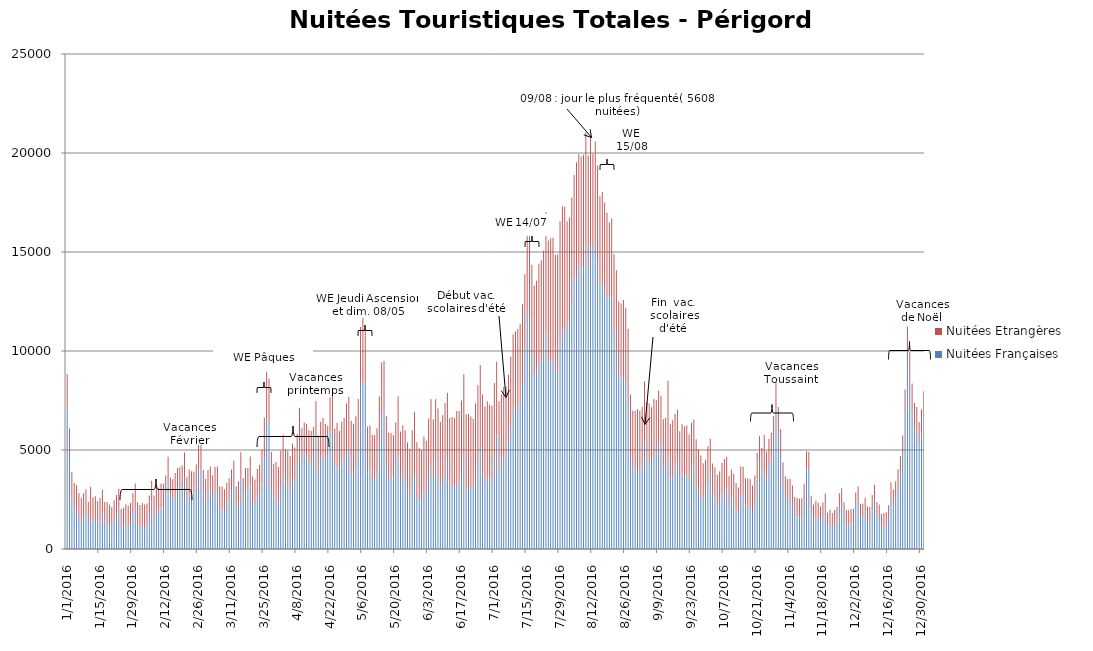
| Category | Nuitées Françaises | Nuitées Etrangères |
|---|---|---|
| 1/1/16 | 7158 | 1670 |
| 1/2/16 | 4649 | 1435 |
| 1/3/16 | 2537 | 1347 |
| 1/4/16 | 2102 | 1237 |
| 1/5/16 | 1889 | 1344 |
| 1/6/16 | 1685 | 1145 |
| 1/7/16 | 1405 | 1171 |
| 1/8/16 | 1640 | 1179 |
| 1/9/16 | 1884 | 1125 |
| 1/10/16 | 1428 | 958 |
| 1/11/16 | 1564 | 1576 |
| 1/12/16 | 1444 | 1171 |
| 1/13/16 | 1313 | 1351 |
| 1/14/16 | 1394 | 1017 |
| 1/15/16 | 1453 | 1117 |
| 1/16/16 | 1887 | 1117 |
| 1/17/16 | 1384 | 992 |
| 1/18/16 | 1260 | 1119 |
| 1/19/16 | 1213 | 1037 |
| 1/20/16 | 1273 | 853 |
| 1/21/16 | 1386 | 1068 |
| 1/22/16 | 1746 | 977 |
| 1/23/16 | 2086 | 959 |
| 1/24/16 | 1160 | 857 |
| 1/25/16 | 1126 | 959 |
| 1/26/16 | 1232 | 1026 |
| 1/27/16 | 1211 | 982 |
| 1/28/16 | 1275 | 1047 |
| 1/29/16 | 1751 | 1070 |
| 1/30/16 | 2103 | 1210 |
| 1/31/16 | 1197 | 1167 |
| 2/1/16 | 1167 | 1056 |
| 2/2/16 | 1160 | 1152 |
| 2/3/16 | 1019 | 1226 |
| 2/4/16 | 1248 | 1055 |
| 2/5/16 | 1663 | 1036 |
| 2/6/16 | 2411 | 1038 |
| 2/7/16 | 1607 | 1097 |
| 2/8/16 | 2017 | 1196 |
| 2/9/16 | 1862 | 1237 |
| 2/10/16 | 2079 | 1235 |
| 2/11/16 | 2050 | 1242 |
| 2/12/16 | 2676 | 1040 |
| 2/13/16 | 3490 | 1174 |
| 2/14/16 | 2747 | 869 |
| 2/15/16 | 2503 | 1025 |
| 2/16/16 | 2704 | 1136 |
| 2/17/16 | 3001 | 1094 |
| 2/18/16 | 3125 | 1010 |
| 2/19/16 | 3127 | 1086 |
| 2/20/16 | 3623 | 1256 |
| 2/21/16 | 2466 | 1178 |
| 2/22/16 | 2742 | 1268 |
| 2/23/16 | 2684 | 1237 |
| 2/24/16 | 2858 | 1058 |
| 2/25/16 | 3113 | 1151 |
| 2/26/16 | 4090 | 1167 |
| 2/27/16 | 4106 | 1138 |
| 2/28/16 | 2898 | 1086 |
| 2/29/16 | 2391 | 1144 |
| 3/1/16 | 2765 | 1225 |
| 3/2/16 | 3048 | 1132 |
| 3/3/16 | 2580 | 1141 |
| 3/4/16 | 2941 | 1204 |
| 3/5/16 | 2982 | 1187 |
| 3/6/16 | 2097 | 1066 |
| 3/7/16 | 2009 | 1142 |
| 3/8/16 | 1877 | 1138 |
| 3/9/16 | 2366 | 966 |
| 3/10/16 | 2539 | 1032 |
| 3/11/16 | 2941 | 1077 |
| 3/12/16 | 3278 | 1192 |
| 3/13/16 | 2122 | 1046 |
| 3/14/16 | 2316 | 1100 |
| 3/15/16 | 3550 | 1335 |
| 3/16/16 | 2280 | 1306 |
| 3/17/16 | 2933 | 1158 |
| 3/18/16 | 3006 | 1082 |
| 3/19/16 | 3217 | 1455 |
| 3/20/16 | 2348 | 1318 |
| 3/21/16 | 2198 | 1315 |
| 3/22/16 | 2587 | 1453 |
| 3/23/16 | 2716 | 1534 |
| 3/24/16 | 3310 | 1715 |
| 3/25/16 | 4618 | 2011 |
| 3/26/16 | 6513 | 2436 |
| 3/27/16 | 6396 | 2214 |
| 3/28/16 | 3078 | 1827 |
| 3/29/16 | 2623 | 1687 |
| 3/30/16 | 2558 | 1843 |
| 3/31/16 | 2285 | 1856 |
| 4/1/16 | 3000 | 1966 |
| 4/2/16 | 3741 | 2042 |
| 4/3/16 | 3361 | 1678 |
| 4/4/16 | 3293 | 1688 |
| 4/5/16 | 2983 | 1696 |
| 4/6/16 | 3579 | 1747 |
| 4/7/16 | 3498 | 1623 |
| 4/8/16 | 4349 | 1453 |
| 4/9/16 | 5427 | 1712 |
| 4/10/16 | 4497 | 1603 |
| 4/11/16 | 4823 | 1569 |
| 4/12/16 | 4694 | 1634 |
| 4/13/16 | 4343 | 1659 |
| 4/14/16 | 4337 | 1617 |
| 4/15/16 | 4596 | 1563 |
| 4/16/16 | 5655 | 1822 |
| 4/17/16 | 3942 | 1794 |
| 4/18/16 | 4566 | 1861 |
| 4/19/16 | 4716 | 1906 |
| 4/20/16 | 4687 | 1624 |
| 4/21/16 | 4587 | 1644 |
| 4/22/16 | 5896 | 1769 |
| 4/23/16 | 5973 | 1891 |
| 4/24/16 | 4317 | 1758 |
| 4/25/16 | 4127.5 | 2246 |
| 4/26/16 | 4104 | 1856 |
| 4/27/16 | 4419 | 2007 |
| 4/28/16 | 4450 | 2166 |
| 4/29/16 | 4934 | 2419 |
| 4/30/16 | 5037 | 2657 |
| 5/1/16 | 3814 | 2660 |
| 5/2/16 | 3689 | 2631 |
| 5/3/16 | 4104 | 2603 |
| 5/4/16 | 4946 | 2626 |
| 5/5/16 | 8166 | 3051 |
| 5/6/16 | 8543 | 3121 |
| 5/7/16 | 8320 | 2718 |
| 5/8/16 | 3852 | 2341 |
| 5/9/16 | 3926 | 2308 |
| 5/10/16 | 3430 | 2340 |
| 5/11/16 | 3528 | 2222 |
| 5/12/16 | 3864 | 2236 |
| 5/13/16 | 5266 | 2436 |
| 5/14/16 | 6839 | 2577 |
| 5/15/16 | 6974 | 2518 |
| 5/16/16 | 4230 | 2475 |
| 5/17/16 | 3450 | 2432.5 |
| 5/18/16 | 3719 | 2143 |
| 5/19/16 | 3625 | 2116 |
| 5/20/16 | 4168 | 2215 |
| 5/21/16 | 4721 | 2998 |
| 5/22/16 | 3540 | 2398 |
| 5/23/16 | 3961 | 2287 |
| 5/24/16 | 3470 | 2525 |
| 5/25/16 | 3020 | 2361 |
| 5/26/16 | 2737 | 2324 |
| 5/27/16 | 3410 | 2584 |
| 5/28/16 | 3792 | 3124 |
| 5/29/16 | 2627 | 2770 |
| 5/30/16 | 2497 | 2595 |
| 5/31/16 | 2461 | 2543 |
| 6/1/16 | 2829 | 2850 |
| 6/2/16 | 2856 | 2613 |
| 6/3/16 | 3644 | 2947 |
| 6/4/16 | 4279 | 3296 |
| 6/5/16 | 3601 | 2953 |
| 6/6/16 | 4482 | 3079 |
| 6/7/16 | 3637 | 3465 |
| 6/8/16 | 3189 | 3242 |
| 6/9/16 | 3384 | 3375 |
| 6/10/16 | 3793 | 3578 |
| 6/11/16 | 4593 | 3302 |
| 6/12/16 | 3308 | 3309 |
| 6/13/16 | 3218 | 3446 |
| 6/14/16 | 3191 | 3421 |
| 6/15/16 | 3184 | 3790 |
| 6/16/16 | 3360 | 3613 |
| 6/17/16 | 3836 | 3670 |
| 6/18/16 | 4720 | 4107 |
| 6/19/16 | 2991 | 3817 |
| 6/20/16 | 3082 | 3749 |
| 6/21/16 | 3049 | 3644 |
| 6/22/16 | 3178 | 3403 |
| 6/23/16 | 3544 | 3802 |
| 6/24/16 | 4243 | 4024 |
| 6/25/16 | 5120 | 4178 |
| 6/26/16 | 3749 | 4056 |
| 6/27/16 | 3367 | 3834 |
| 6/28/16 | 3511 | 3954 |
| 6/29/16 | 3639 | 3640 |
| 6/30/16 | 3436 | 3797 |
| 7/1/16 | 4649 | 3730 |
| 7/2/16 | 5734 | 3722 |
| 7/3/16 | 3971 | 3492 |
| 7/4/16 | 4380 | 3434 |
| 7/5/16 | 4695 | 3487 |
| 7/6/16 | 4763 | 3425 |
| 7/7/16 | 5516 | 3286 |
| 7/8/16 | 6251 | 3457 |
| 7/9/16 | 7042 | 3788 |
| 7/10/16 | 6913 | 4089 |
| 7/11/16 | 7273 | 3841 |
| 7/12/16 | 7323 | 4056 |
| 7/13/16 | 8437 | 3918 |
| 7/14/16 | 10042 | 3833 |
| 7/15/16 | 12110 | 3794 |
| 7/16/16 | 11700 | 4234 |
| 7/17/16 | 9744 | 4618 |
| 7/18/16 | 8754 | 4557 |
| 7/19/16 | 9011 | 4534 |
| 7/20/16 | 9386 | 5019 |
| 7/21/16 | 9520 | 5065 |
| 7/22/16 | 9817 | 5265 |
| 7/23/16 | 10932 | 6078 |
| 7/24/16 | 9479 | 6103 |
| 7/25/16 | 9515 | 6179 |
| 7/26/16 | 9569 | 6145 |
| 7/27/16 | 9026 | 5825 |
| 7/28/16 | 8965 | 5907 |
| 7/29/16 | 10473 | 6084 |
| 7/30/16 | 11094 | 6213 |
| 7/31/16 | 10962 | 6323 |
| 8/1/16 | 11386 | 5164 |
| 8/2/16 | 11462 | 5285 |
| 8/3/16 | 12473 | 5269 |
| 8/4/16 | 13700 | 5195 |
| 8/5/16 | 13735 | 5801 |
| 8/6/16 | 14432 | 5499 |
| 8/7/16 | 14165 | 5657 |
| 8/8/16 | 14230 | 5685 |
| 8/9/16 | 15425 | 5608 |
| 8/10/16 | 14205 | 5667 |
| 8/11/16 | 15353 | 5468 |
| 8/12/16 | 15062 | 4903 |
| 8/13/16 | 15534 | 5053 |
| 8/14/16 | 14551 | 4810 |
| 8/15/16 | 13380 | 4437 |
| 8/16/16 | 13491 | 4550 |
| 8/17/16 | 13023 | 4477 |
| 8/18/16 | 12758 | 4222 |
| 8/19/16 | 12742 | 3747 |
| 8/20/16 | 12754 | 3934 |
| 8/21/16 | 11074 | 3811 |
| 8/22/16 | 10024 | 4056 |
| 8/23/16 | 8722 | 3784 |
| 8/24/16 | 8716 | 3697 |
| 8/25/16 | 8635 | 3943 |
| 8/26/16 | 8466 | 3705 |
| 8/27/16 | 7691 | 3431 |
| 8/28/16 | 4698 | 3106 |
| 8/29/16 | 4069 | 2914 |
| 8/30/16 | 3953 | 3018 |
| 8/31/16 | 3991 | 3069 |
| 9/1/16 | 3968 | 3011 |
| 9/2/16 | 4295 | 2884 |
| 9/3/16 | 5554 | 2921 |
| 9/4/16 | 4419 | 3011 |
| 9/5/16 | 4515 | 2837 |
| 9/6/16 | 4486 | 2676 |
| 9/7/16 | 4694 | 2882 |
| 9/8/16 | 4827 | 2681 |
| 9/9/16 | 5367 | 2636 |
| 9/10/16 | 5228 | 2510 |
| 9/11/16 | 4074 | 2476 |
| 9/12/16 | 4173 | 2450 |
| 9/13/16 | 4583 | 3915 |
| 9/14/16 | 3620 | 2702 |
| 9/15/16 | 3656 | 2847 |
| 9/16/16 | 4133 | 2699 |
| 9/17/16 | 4506 | 2523 |
| 9/18/16 | 3598 | 2355 |
| 9/19/16 | 3870 | 2429 |
| 9/20/16 | 3656 | 2531 |
| 9/21/16 | 3702 | 2535 |
| 9/22/16 | 3532 | 2253 |
| 9/23/16 | 4191 | 2190 |
| 9/24/16 | 4234 | 2302 |
| 9/25/16 | 3280 | 2262 |
| 9/26/16 | 2899 | 2147 |
| 9/27/16 | 2570 | 2150 |
| 9/28/16 | 2591 | 1736 |
| 9/29/16 | 2655 | 1849 |
| 9/30/16 | 3229 | 1961 |
| 10/1/16 | 3807 | 1764 |
| 10/2/16 | 2709 | 1603 |
| 10/3/16 | 2607 | 1503 |
| 10/4/16 | 2129 | 1615 |
| 10/5/16 | 2326 | 1587 |
| 10/6/16 | 2708 | 1643 |
| 10/7/16 | 2933 | 1630 |
| 10/8/16 | 3053 | 1608 |
| 10/9/16 | 2136 | 1536 |
| 10/10/16 | 2660 | 1359 |
| 10/11/16 | 2520 | 1265 |
| 10/12/16 | 1980 | 1353 |
| 10/13/16 | 1862 | 1242 |
| 10/14/16 | 2778 | 1402 |
| 10/15/16 | 2742 | 1408 |
| 10/16/16 | 2214 | 1353 |
| 10/17/16 | 2158 | 1418 |
| 10/18/16 | 2113 | 1415 |
| 10/19/16 | 1830 | 1381 |
| 10/20/16 | 2378 | 1334 |
| 10/21/16 | 3507 | 1353 |
| 10/22/16 | 4445 | 1254 |
| 10/23/16 | 3950 | 1152 |
| 10/24/16 | 3820 | 1940 |
| 10/25/16 | 3543 | 1386 |
| 10/26/16 | 4268 | 1289 |
| 10/27/16 | 4572 | 1317 |
| 10/28/16 | 5385 | 1317 |
| 10/29/16 | 7097 | 1320 |
| 10/30/16 | 5881 | 1297 |
| 10/31/16 | 4731 | 1334 |
| 11/1/16 | 3260 | 1125 |
| 11/2/16 | 2630 | 1047 |
| 11/3/16 | 2503 | 1032 |
| 11/4/16 | 2586 | 966 |
| 11/5/16 | 2325 | 883 |
| 11/6/16 | 1885 | 746 |
| 11/7/16 | 1592 | 982 |
| 11/8/16 | 1627 | 918 |
| 11/9/16 | 1616 | 950 |
| 11/10/16 | 2426 | 859 |
| 11/11/16 | 4054 | 879 |
| 11/12/16 | 4052 | 843 |
| 11/13/16 | 1852 | 832 |
| 11/14/16 | 1471 | 773 |
| 11/15/16 | 1575 | 861 |
| 11/16/16 | 1558 | 777 |
| 11/17/16 | 1422 | 722 |
| 11/18/16 | 1629 | 720 |
| 11/19/16 | 2081 | 726 |
| 11/20/16 | 1180 | 669 |
| 11/21/16 | 1268 | 715 |
| 11/22/16 | 1134 | 684 |
| 11/23/16 | 1213 | 753 |
| 11/24/16 | 1475 | 654 |
| 11/25/16 | 2134 | 678 |
| 11/26/16 | 2280 | 790 |
| 11/27/16 | 1718 | 640 |
| 11/28/16 | 1252 | 707 |
| 11/29/16 | 1177 | 785 |
| 11/30/16 | 1289 | 718 |
| 12/1/16 | 1312 | 715 |
| 12/2/16 | 2174 | 675 |
| 12/3/16 | 2421 | 731 |
| 12/4/16 | 1639 | 643 |
| 12/5/16 | 1570 | 721 |
| 12/6/16 | 1906 | 684 |
| 12/7/16 | 1501 | 647 |
| 12/8/16 | 1368 | 751 |
| 12/9/16 | 1947 | 784 |
| 12/10/16 | 2498 | 742 |
| 12/11/16 | 1746 | 628 |
| 12/12/16 | 1564 | 683 |
| 12/13/16 | 1058 | 711 |
| 12/14/16 | 1173 | 651 |
| 12/15/16 | 1178 | 678 |
| 12/16/16 | 1586 | 618 |
| 12/17/16 | 2598 | 774 |
| 12/18/16 | 2274 | 718 |
| 12/19/16 | 2535 | 891 |
| 12/20/16 | 3124 | 901 |
| 12/21/16 | 3816 | 885 |
| 12/22/16 | 4771 | 962 |
| 12/23/16 | 6871 | 1189 |
| 12/24/16 | 9849 | 1387 |
| 12/25/16 | 8585 | 1354 |
| 12/26/16 | 7029 | 1335 |
| 12/27/16 | 6144 | 1229 |
| 12/28/16 | 5852 | 1322 |
| 12/29/16 | 5262 | 1148 |
| 12/30/16 | 5886 | 1171 |
| 12/31/16 | 6711 | 1257 |